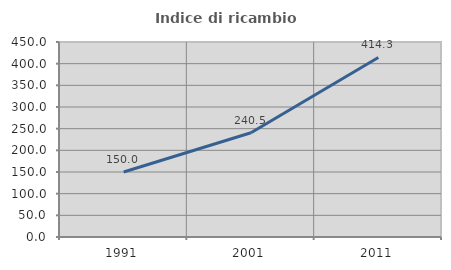
| Category | Indice di ricambio occupazionale  |
|---|---|
| 1991.0 | 150 |
| 2001.0 | 240.476 |
| 2011.0 | 414.286 |